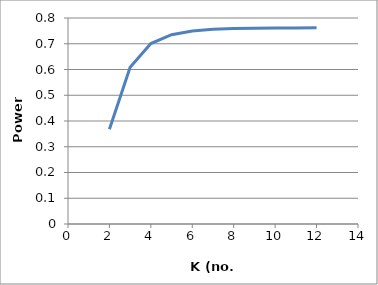
| Category | Series 0 |
|---|---|
| 2.0 | 0.368 |
| 3.0 | 0.609 |
| 4.0 | 0.701 |
| 5.0 | 0.735 |
| 6.0 | 0.75 |
| 7.0 | 0.756 |
| 8.0 | 0.759 |
| 9.0 | 0.761 |
| 10.0 | 0.761 |
| 11.0 | 0.762 |
| 12.0 | 0.762 |